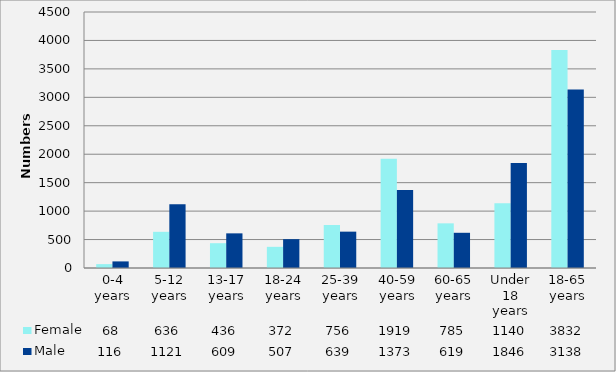
| Category | Female | Male |
|---|---|---|
| 0-4 years | 68 | 116 |
| 5-12 years | 636 | 1121 |
| 13-17 years | 436 | 609 |
| 18-24 years | 372 | 507 |
| 25-39 years | 756 | 639 |
| 40-59 years | 1919 | 1373 |
| 60-65 years | 785 | 619 |
| Under 18 years | 1140 | 1846 |
| 18-65 years | 3832 | 3138 |